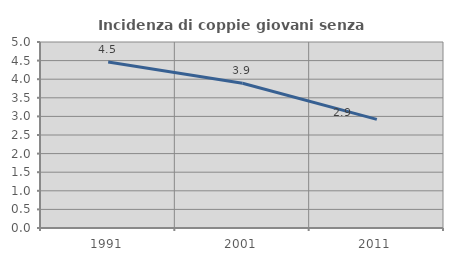
| Category | Incidenza di coppie giovani senza figli |
|---|---|
| 1991.0 | 4.462 |
| 2001.0 | 3.892 |
| 2011.0 | 2.92 |